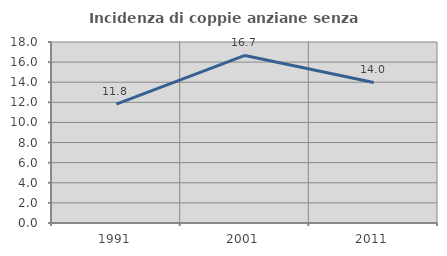
| Category | Incidenza di coppie anziane senza figli  |
|---|---|
| 1991.0 | 11.816 |
| 2001.0 | 16.667 |
| 2011.0 | 13.976 |